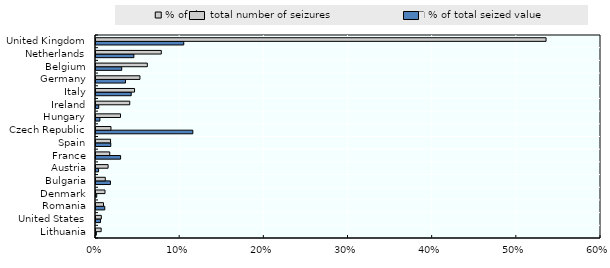
| Category | % of total seized value | % of the total number of seizures |
|---|---|---|
| Lithuania | 0 | 0.006 |
| United States | 0.005 | 0.006 |
| Romania | 0.01 | 0.009 |
| Denmark | 0.001 | 0.011 |
| Bulgaria | 0.017 | 0.011 |
| Austria | 0.003 | 0.014 |
| France | 0.029 | 0.016 |
| Spain | 0.018 | 0.017 |
| Czech Republic | 0.115 | 0.018 |
| Hungary | 0.005 | 0.029 |
| Ireland | 0.003 | 0.04 |
| Italy | 0.042 | 0.046 |
| Germany | 0.035 | 0.052 |
| Belgium | 0.031 | 0.061 |
| Netherlands | 0.045 | 0.078 |
| United Kingdom | 0.104 | 0.535 |